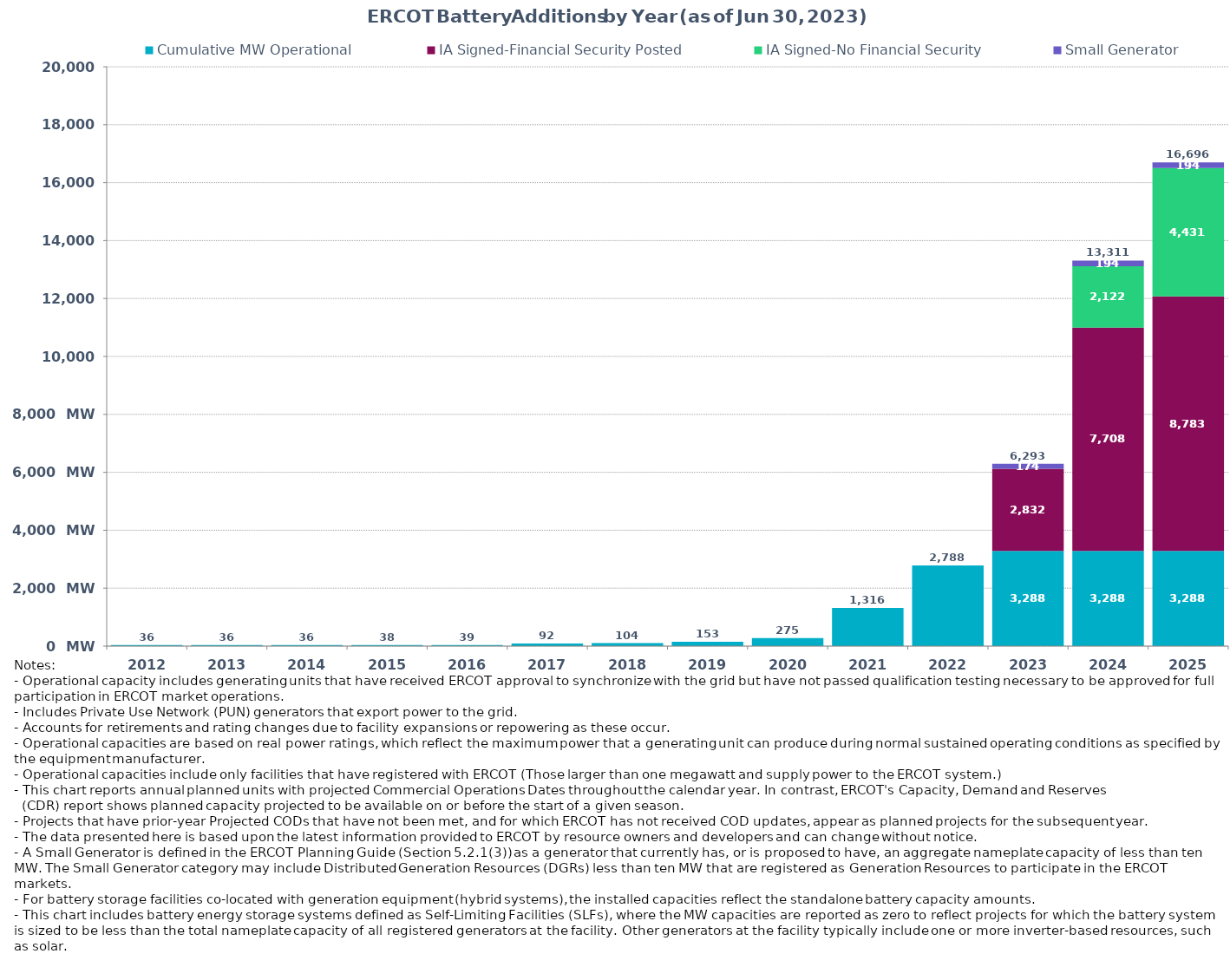
| Category | Cumulative MW Operational  | IA Signed-Financial Security Posted  | IA Signed-No Financial Security  | Small Generator | Cumulative Installed and Planned |
|---|---|---|---|---|---|
| 2012.0 | 36 | 0 | 0 | 0 | 36 |
| 2013.0 | 36 | 0 | 0 | 0 | 36 |
| 2014.0 | 36 | 0 | 0 | 0 | 36 |
| 2015.0 | 38 | 0 | 0 | 0 | 38 |
| 2016.0 | 39 | 0 | 0 | 0 | 39 |
| 2017.0 | 92.3 | 0 | 0 | 0 | 92.3 |
| 2018.0 | 103.7 | 0 | 0 | 0 | 103.7 |
| 2019.0 | 153.3 | 0 | 0 | 0 | 153.3 |
| 2020.0 | 275.4 | 0 | 0 | 0 | 275.4 |
| 2021.0 | 1316.43 | 0 | 0 | 0 | 1316.43 |
| 2022.0 | 2787.86 | 0 | 0 | 0 | 2787.86 |
| 2023.0 | 3287.56 | 2831.75 | 0 | 174 | 6293.31 |
| 2024.0 | 3287.56 | 7707.83 | 2121.85 | 194.2 | 13311.44 |
| 2025.0 | 3287.56 | 8783.42 | 4431.2 | 194.2 | 16696.38 |